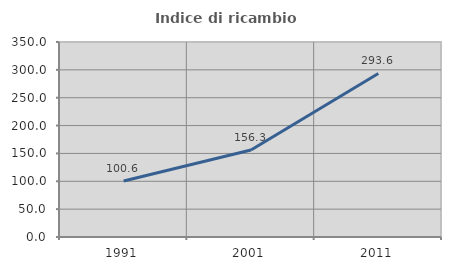
| Category | Indice di ricambio occupazionale  |
|---|---|
| 1991.0 | 100.558 |
| 2001.0 | 156.25 |
| 2011.0 | 293.599 |